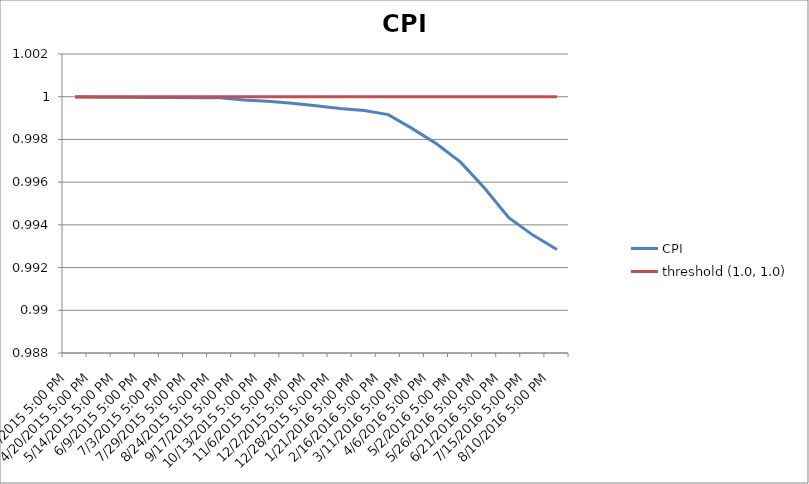
| Category | CPI | threshold (1.0, 1.0) |
|---|---|---|
| 3/25/2015 5:00 PM | 1 | 1 |
| 4/20/2015 5:00 PM | 1 | 1 |
| 5/14/2015 5:00 PM | 1 | 1 |
| 6/9/2015 5:00 PM | 1 | 1 |
| 7/3/2015 5:00 PM | 1 | 1 |
| 7/29/2015 5:00 PM | 1 | 1 |
| 8/24/2015 5:00 PM | 1 | 1 |
| 9/17/2015 5:00 PM | 1 | 1 |
| 10/13/2015 5:00 PM | 1 | 1 |
| 11/6/2015 5:00 PM | 1 | 1 |
| 12/2/2015 5:00 PM | 1 | 1 |
| 12/28/2015 5:00 PM | 0.999 | 1 |
| 1/21/2016 5:00 PM | 0.999 | 1 |
| 2/16/2016 5:00 PM | 0.999 | 1 |
| 3/11/2016 5:00 PM | 0.999 | 1 |
| 4/6/2016 5:00 PM | 0.998 | 1 |
| 5/2/2016 5:00 PM | 0.997 | 1 |
| 5/26/2016 5:00 PM | 0.996 | 1 |
| 6/21/2016 5:00 PM | 0.994 | 1 |
| 7/15/2016 5:00 PM | 0.994 | 1 |
| 8/10/2016 5:00 PM | 0.993 | 1 |